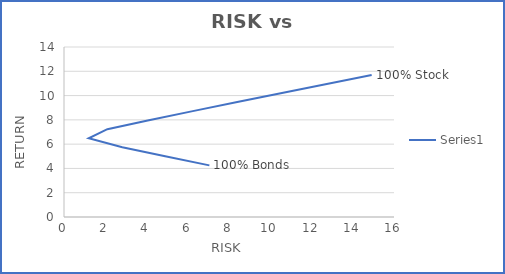
| Category | Series 0 |
|---|---|
| 7.048936089935842 | 4.25 |
| 4.906268949007993 | 4.995 |
| 2.8263757711953303 | 5.74 |
| 1.199281034620325 | 6.485 |
| 2.1026411962101386 | 7.23 |
| 4.115443475495685 | 7.975 |
| 6.243844969247715 | 8.72 |
| 8.400433024552958 | 9.465 |
| 10.567965745591719 | 10.21 |
| 12.740858487558832 | 10.955 |
| 14.916769087171657 | 11.7 |